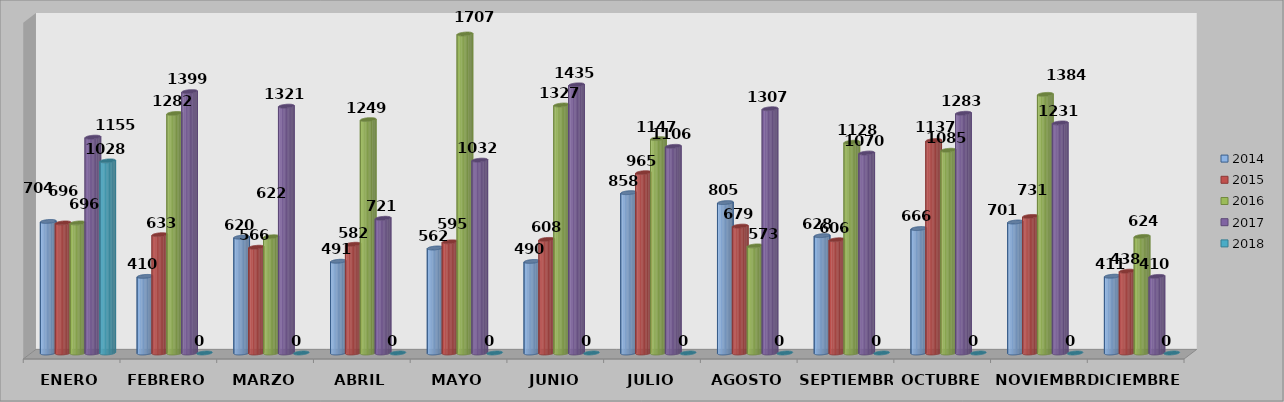
| Category | 2014 | 2015 | 2016 | 2017 | 2018 |
|---|---|---|---|---|---|
| ENERO | 704 | 696 | 696 | 1155 | 1028 |
| FEBRERO | 410 | 633 | 1282 | 1399 | 0 |
| MARZO | 620 | 566 | 622 | 1321 | 0 |
| ABRIL | 491 | 582 | 1249 | 721 | 0 |
| MAYO | 562 | 595 | 1707 | 1032 | 0 |
| JUNIO | 490 | 608 | 1327 | 1435 | 0 |
| JULIO | 858 | 965 | 1147 | 1106 | 0 |
| AGOSTO | 805 | 679 | 573 | 1307 | 0 |
| SEPTIEMBRE | 628 | 606 | 1128 | 1070 | 0 |
| OCTUBRE | 666 | 1137 | 1085 | 1283 | 0 |
| NOVIEMBRE | 701 | 731 | 1384 | 1231 | 0 |
| DICIEMBRE | 411 | 438 | 624 | 410 | 0 |